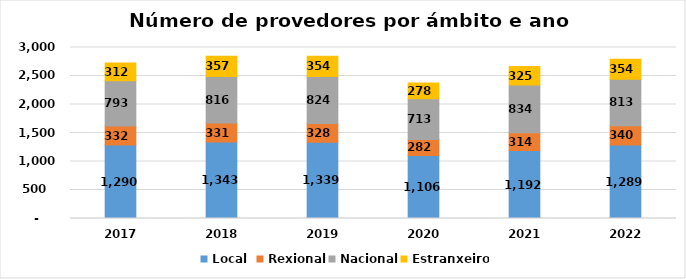
| Category | Local  | Rexional | Nacional | Estranxeiro |
|---|---|---|---|---|
| 2017.0 | 1290 | 332 | 793 | 312 |
| 2018.0 | 1343 | 331 | 816 | 357 |
| 2019.0 | 1339 | 328 | 824 | 354 |
| 2020.0 | 1106 | 282 | 713 | 278 |
| 2021.0 | 1192 | 314 | 834 | 325 |
| 2022.0 | 1289 | 340 | 813 | 354 |